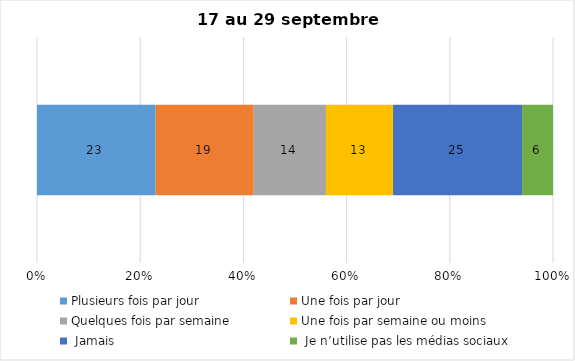
| Category | Plusieurs fois par jour | Une fois par jour | Quelques fois par semaine   | Une fois par semaine ou moins   |  Jamais   |  Je n’utilise pas les médias sociaux |
|---|---|---|---|---|---|---|
| 0 | 23 | 19 | 14 | 13 | 25 | 6 |